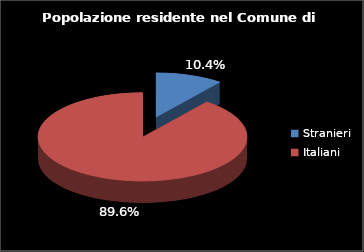
| Category | Series 0 |
|---|---|
| Stranieri | 2143 |
| Italiani | 18456 |